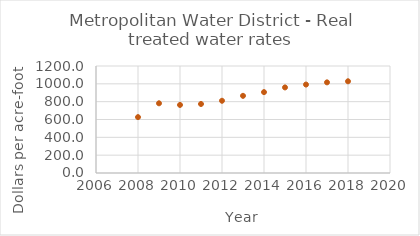
| Category | Series 0 |
|---|---|
| 2008.0 | 626.646 |
| 2009.0 | 781.704 |
| 2010.0 | 763.375 |
| 2011.0 | 773.947 |
| 2012.0 | 810.165 |
| 2013.0 | 865.478 |
| 2014.0 | 907.058 |
| 2015.0 | 959.79 |
| 2016.0 | 991.928 |
| 2017.0 | 1016.618 |
| 2018.0 | 1028.604 |